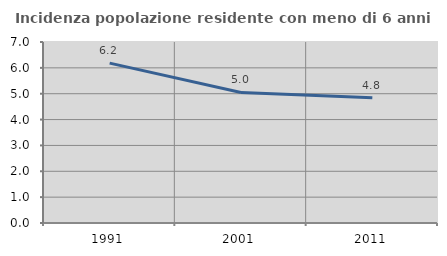
| Category | Incidenza popolazione residente con meno di 6 anni |
|---|---|
| 1991.0 | 6.183 |
| 2001.0 | 5.048 |
| 2011.0 | 4.847 |